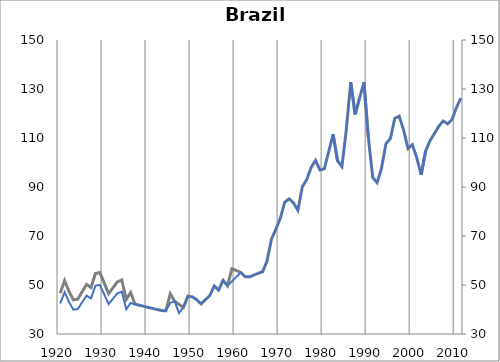
| Category | Bra17 |
|---|---|
| 1920.0 | 46.669 |
| 1921.0 | 51.782 |
| 1922.0 | 47.376 |
| 1923.0 | 43.927 |
| 1924.0 | 44.232 |
| 1925.0 | 47.302 |
| 1926.0 | 50.245 |
| 1927.0 | 48.972 |
| 1928.0 | 54.689 |
| 1929.0 | 55.075 |
| 1930.0 | 50.814 |
| 1931.0 | 46.453 |
| 1932.0 | 48.899 |
| 1933.0 | 51.272 |
| 1934.0 | 52.01 |
| 1935.0 | 44.085 |
| 1936.0 | 46.916 |
| 1937.0 | 42.187 |
| 1938.0 | 41.741 |
| 1939.0 | 41.3 |
| 1940.0 | 40.863 |
| 1941.0 | 40.431 |
| 1942.0 | 40.004 |
| 1943.0 | 39.581 |
| 1944.0 | 39.458 |
| 1945.0 | 46.419 |
| 1946.0 | 43.291 |
| 1947.0 | 42.088 |
| 1948.0 | 40.884 |
| 1949.0 | 45.453 |
| 1950.0 | 45.183 |
| 1951.0 | 44.018 |
| 1952.0 | 42.278 |
| 1953.0 | 44.029 |
| 1954.0 | 45.78 |
| 1955.0 | 49.63 |
| 1956.0 | 47.934 |
| 1957.0 | 51.899 |
| 1958.0 | 49.688 |
| 1959.0 | 56.621 |
| 1960.0 | 55.949 |
| 1961.0 | 55.141 |
| 1962.0 | 53.4 |
| 1963.0 | 53.308 |
| 1964.0 | 54.068 |
| 1965.0 | 54.807 |
| 1966.0 | 55.424 |
| 1967.0 | 59.877 |
| 1968.0 | 68.822 |
| 1969.0 | 72.803 |
| 1970.0 | 77.264 |
| 1971.0 | 83.771 |
| 1972.0 | 85.196 |
| 1973.0 | 83.516 |
| 1974.0 | 80.443 |
| 1975.0 | 90.095 |
| 1976.0 | 93.033 |
| 1977.0 | 97.93 |
| 1978.0 | 100.867 |
| 1979.0 | 96.95 |
| 1980.0 | 97.44 |
| 1981.0 | 104.456 |
| 1982.0 | 111.471 |
| 1983.0 | 100.704 |
| 1984.0 | 98.317 |
| 1985.0 | 113.566 |
| 1986.0 | 132.762 |
| 1987.0 | 119.656 |
| 1988.0 | 126.282 |
| 1989.0 | 132.713 |
| 1990.0 | 110.205 |
| 1991.0 | 93.845 |
| 1992.0 | 91.745 |
| 1993.0 | 97.798 |
| 1994.0 | 107.713 |
| 1995.0 | 109.738 |
| 1996.0 | 118.021 |
| 1997.0 | 118.891 |
| 1998.0 | 113.325 |
| 1999.0 | 105.699 |
| 2000.0 | 107.259 |
| 2001.0 | 101.935 |
| 2002.0 | 94.931 |
| 2003.0 | 104.602 |
| 2004.0 | 108.867 |
| 2005.0 | 111.834 |
| 2006.0 | 114.789 |
| 2007.0 | 116.926 |
| 2008.0 | 115.775 |
| 2009.0 | 117.501 |
| 2010.0 | 122.367 |
| 2011.0 | 126.265 |